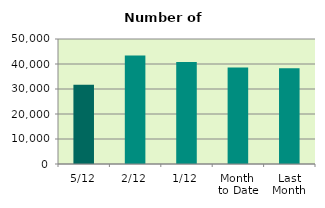
| Category | Series 0 |
|---|---|
| 5/12 | 31654 |
| 2/12 | 43414 |
| 1/12 | 40834 |
| Month 
to Date | 38634 |
| Last
Month | 38326.182 |